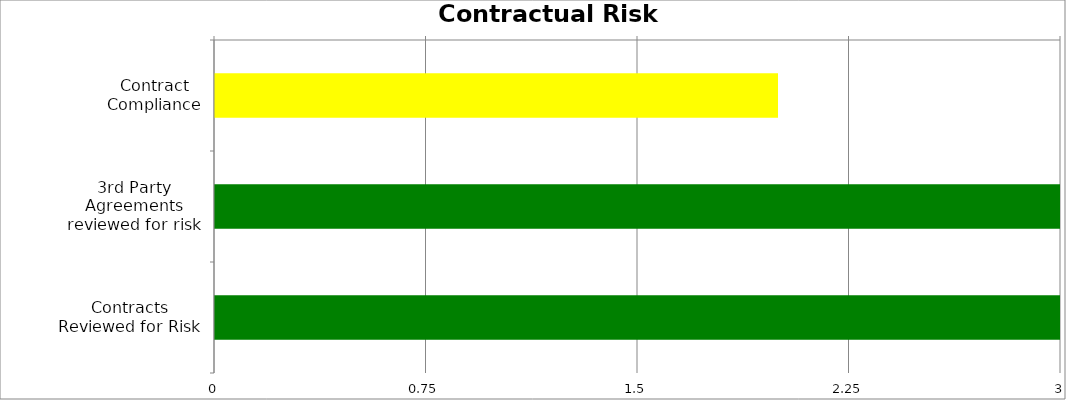
| Category | Low | Medium | High |
|---|---|---|---|
| Contract Compliance | 0 | 2 | 0 |
| 3rd Party Agreements reviewed for risk | 0 | 0 | 3 |
| Contracts Reviewed for Risk | 0 | 0 | 3 |